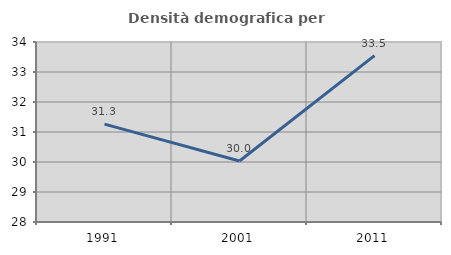
| Category | Densità demografica |
|---|---|
| 1991.0 | 31.263 |
| 2001.0 | 30.033 |
| 2011.0 | 33.546 |